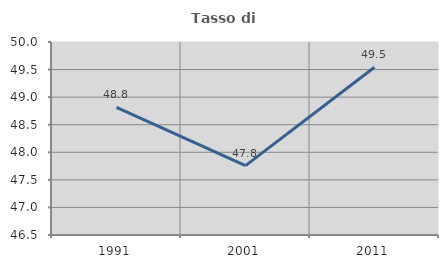
| Category | Tasso di occupazione   |
|---|---|
| 1991.0 | 48.814 |
| 2001.0 | 47.759 |
| 2011.0 | 49.542 |